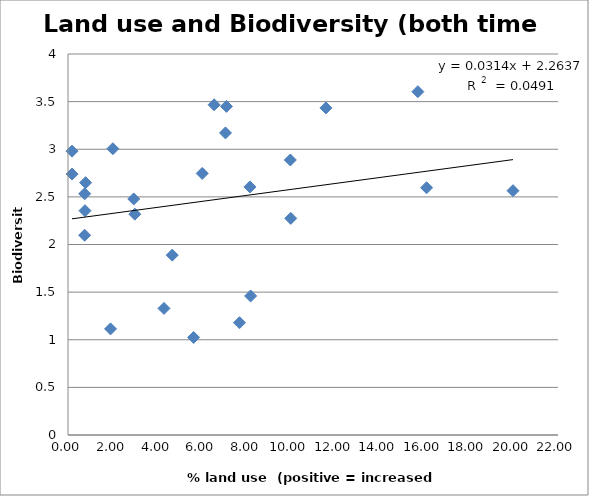
| Category | Land use and Biodiversity (both time points) |
|---|---|
| 0.7469851305 | 2.097 |
| 0.75 | 2.532 |
| 2.951961863 | 2.478 |
| 3.0 | 2.318 |
| 7.113299087 | 3.45 |
| 7.07 | 3.171 |
| 2.014550928 | 3.006 |
| 1.91 | 1.114 |
| 5.641275137 | 1.024 |
| 11.58 | 3.434 |
| 7.699722858 | 1.179 |
| 19.98 | 2.565 |
| 4.308650066 | 1.329 |
| 4.68 | 1.888 |
| 0.7621736062 | 2.355 |
| 0.79 | 2.649 |
| 6.026315789 | 2.746 |
| 6.56 | 3.467 |
| 10.00235239 | 2.274 |
| 9.98 | 2.887 |
| 0.1830108856 | 2.74 |
| 0.18 | 2.98 |
| 15.70730132 | 3.604 |
| 16.1 | 2.596 |
| 8.169493931 | 2.605 |
| 8.2 | 1.46 |